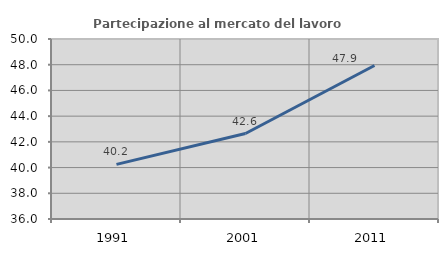
| Category | Partecipazione al mercato del lavoro  femminile |
|---|---|
| 1991.0 | 40.248 |
| 2001.0 | 42.647 |
| 2011.0 | 47.936 |